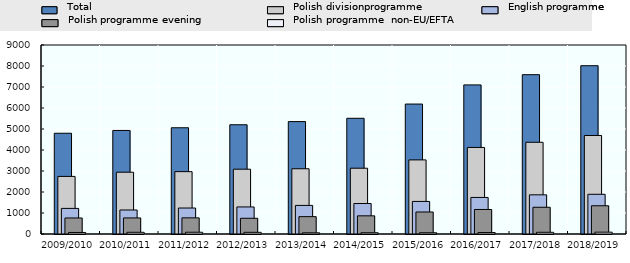
| Category | Total | Polish programme  | English programme | Polish programme evening | Polish programme non-EU/EFTA |
|---|---|---|---|---|---|
| 2009/2010 | 4797 | 2742 | 1219 | 763 | 73 |
| 2010/2011 | 4931 | 2942 | 1143 | 765 | 81 |
| 2011/2012 | 5059 | 2970 | 1237 | 769 | 83 |
| 2012/2013 | 5202 | 3086 | 1288 | 749 | 79 |
| 2013/2014 | 5352 | 3107 | 1361 | 826 | 58 |
| 2014/2015 | 5510 | 3133 | 1451 | 865 | 61 |
| 2015/2016 | 6188 | 3529 | 1551 | 1048 | 60 |
| 2016/2017 | 7100 | 4122 | 1741 | 1168 | 69 |
| 2017/2018 | 7587 | 4368 | 1865 | 1273 | 81 |
| 2018/2019 | 8014 | 4691 | 1891 | 1345 | 87 |